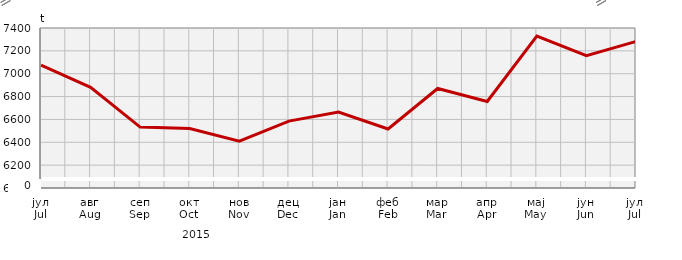
| Category | Прикупљање крављег млијека
Collecting of cow’s milk |
|---|---|
| јул
Jul | 7075.246 |
| авг
Aug | 6880.441 |
| сеп
Sep | 6532.974 |
| окт
Oct | 6519.778 |
| нов
Nov | 6409.6 |
| дец
Dec | 6585.351 |
| јан
Jan | 6663.893 |
| феб
Feb | 6516.44 |
| мар
Mar | 6870.8 |
| апр
Apr | 6757.289 |
| мај
May | 7329.328 |
| јун
Jun | 7158.306 |
| јул
Jul | 7282.65 |